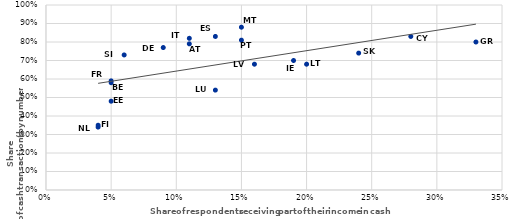
| Category | Series 0 |
|---|---|
| 0.04 | 0.34 |
| 0.04 | 0.35 |
| 0.05 | 0.48 |
| 0.05 | 0.59 |
| 0.05 | 0.58 |
| 0.06 | 0.73 |
| 0.09 | 0.77 |
| 0.11 | 0.82 |
| 0.11 | 0.79 |
| 0.13 | 0.83 |
| 0.13 | 0.54 |
| 0.15 | 0.81 |
| 0.15 | 0.88 |
| 0.16 | 0.68 |
| 0.19 | 0.7 |
| 0.2 | 0.68 |
| 0.24 | 0.74 |
| 0.28 | 0.83 |
| 0.33 | 0.8 |